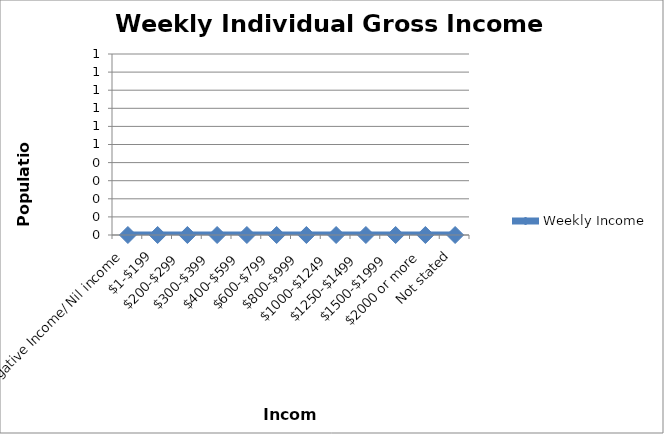
| Category | Weekly Income |
|---|---|
| Negative Income/ Nil income | 10946 |
| $1-$199  | 10165 |
| $200-$299  | 8843 |
| $300-$399  | 8875 |
| $400-$599  | 12659 |
| $600-$799  | 11258 |
| $800-$999  | 10102 |
| $1000-$1249  | 10906 |
| $1250-$1499  | 8518 |
| $1500-$1999  | 11347 |
| $2000 or more  | 12665 |
| Not stated | 6668 |